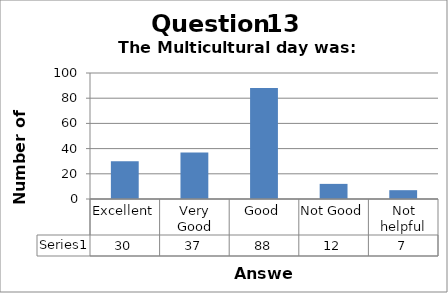
| Category | Series 0 |
|---|---|
| Excellent | 30 |
| Very Good | 37 |
| Good | 88 |
| Not Good | 12 |
| Not helpful | 7 |